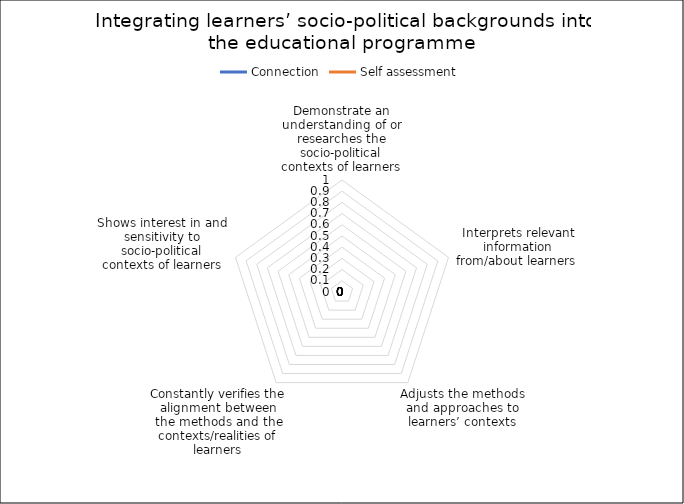
| Category | Connection | Self assessment |
|---|---|---|
| Demonstrate an understanding of or researches the socio-political contexts of learners | 0 | 0 |
| Interprets relevant information from/about learners  | 0 | 0 |
| Adjusts the methods and approaches to learners’ contexts | 0 | 0 |
| Constantly verifies the alignment between the methods and the contexts/realities of learners | 0 | 0 |
| Shows interest in and sensitivity to socio-political contexts of learners | 0 | 0 |